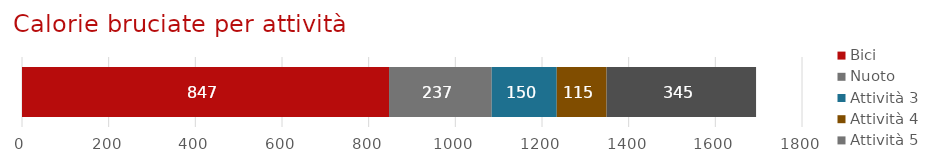
| Category | Bici | Nuoto | Attività 3 | Attività 4 | Attività 5 |
|---|---|---|---|---|---|
| Registro attività | 847 | 237 | 150 | 115 | 345 |